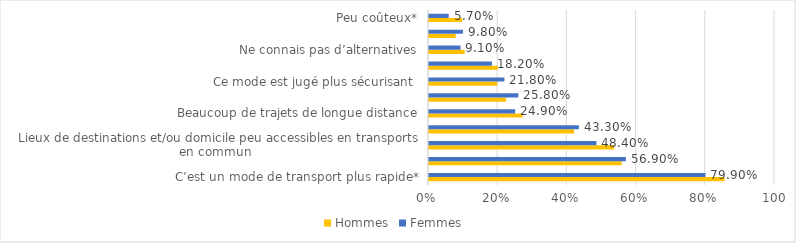
| Category | Hommes | Femmes  |
|---|---|---|
|  C’est un mode de transport plus rapide* | 0.854 | 0.799 |
|  Ce mode est jugé plus confortable  | 0.557 | 0.569 |
|  Lieux de destinations et/ou domicile peu accessibles en transports en commun  | 0.535 | 0.484 |
|  Trajets souvent complexes | 0.419 | 0.433 |
|  Beaucoup de trajets de longue distance | 0.271 | 0.249 |
|  Certaines limitations matérielles (bagages, poussette, courses, matériel… | 0.223 | 0.258 |
|  Ce mode est jugé plus sécurisant  | 0.197 | 0.218 |
|  Facilité à trouver une place pour se garer à destination | 0.199 | 0.182 |
|  Ne connais pas d’alternatives | 0.103 | 0.091 |
|  Certaines limitations physiques rendent d’autres modes de transports moins accessibles | 0.077 | 0.098 |
|  Peu coûteux* | 0.096 | 0.057 |